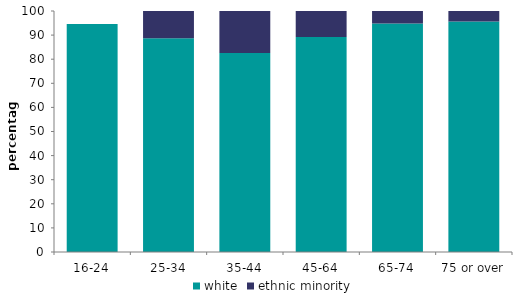
| Category | white | ethnic minority |
|---|---|---|
| 16-24 | 94.62 | 0 |
| 25-34 | 88.737 | 11.263 |
| 35-44 | 82.597 | 17.403 |
| 45-64 | 89.185 | 10.815 |
| 65-74 | 94.771 | 5.229 |
| 75 or over | 95.604 | 4.396 |